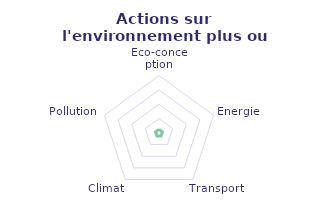
| Category | Pondération satifaction |
|---|---|
| Eco-conception | 0 |
| Energie | 0 |
| Transport | 0 |
| Climat | 0 |
| Pollution | 0 |